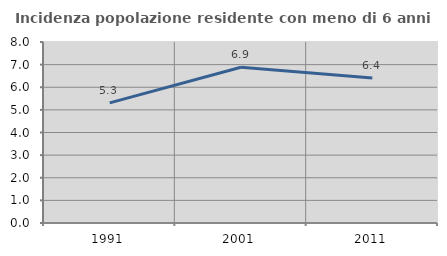
| Category | Incidenza popolazione residente con meno di 6 anni |
|---|---|
| 1991.0 | 5.309 |
| 2001.0 | 6.884 |
| 2011.0 | 6.413 |